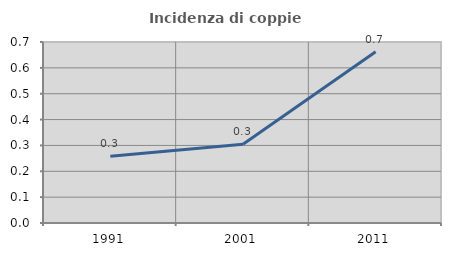
| Category | Incidenza di coppie miste |
|---|---|
| 1991.0 | 0.258 |
| 2001.0 | 0.305 |
| 2011.0 | 0.663 |